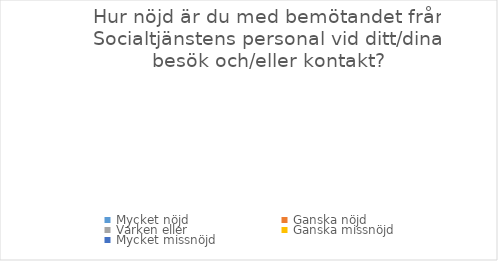
| Category | Series 0 |
|---|---|
| Mycket nöjd  | 0 |
| Ganska nöjd | 0 |
| Varken eller  | 0 |
| Ganska missnöjd | 0 |
| Mycket missnöjd  | 0 |